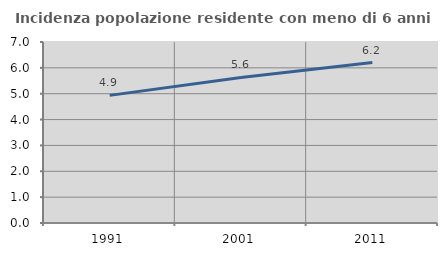
| Category | Incidenza popolazione residente con meno di 6 anni |
|---|---|
| 1991.0 | 4.936 |
| 2001.0 | 5.631 |
| 2011.0 | 6.206 |